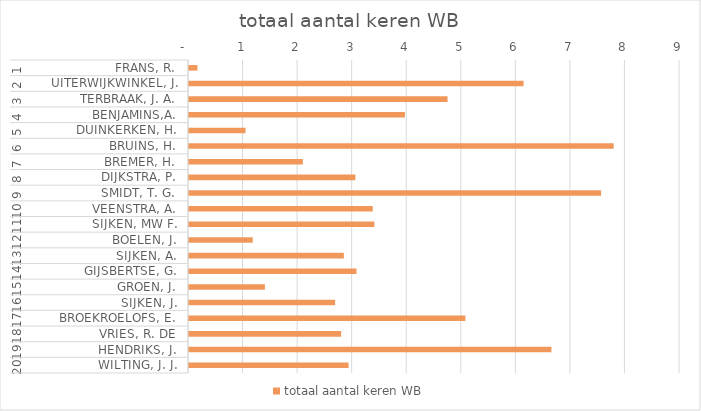
| Category | totaal aantal keren WB |
|---|---|
| 0 | 0.154 |
| 1 | 6.133 |
| 2 | 4.739 |
| 3 | 3.958 |
| 4 | 1.035 |
| 5 | 7.784 |
| 6 | 2.087 |
| 7 | 3.05 |
| 8 | 7.553 |
| 9 | 3.367 |
| 10 | 3.397 |
| 11 | 1.168 |
| 12 | 2.839 |
| 13 | 3.07 |
| 14 | 1.391 |
| 15 | 2.679 |
| 16 | 5.066 |
| 17 | 2.789 |
| 18 | 6.643 |
| 19 | 2.925 |